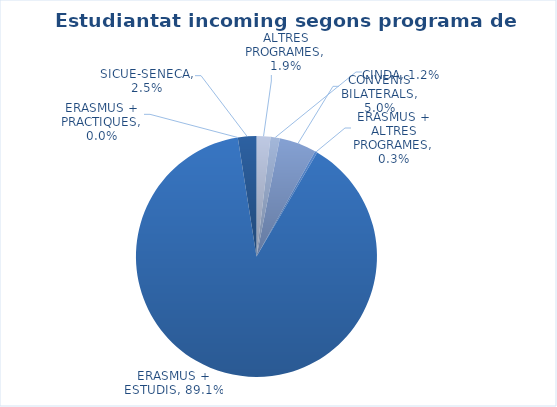
| Category | % Estudiants incoming |
|---|---|
| ALTRES PROGRAMES | 0.019 |
| CINDA | 0.012 |
| CONVENIS BILATERALS | 0.05 |
| ERASMUS + ALTRES PROGRAMES | 0.003 |
| ERASMUS + ESTUDIS | 0.891 |
| ERASMUS + PRACTIQUES | 0 |
| SICUE-SENECA | 0.025 |